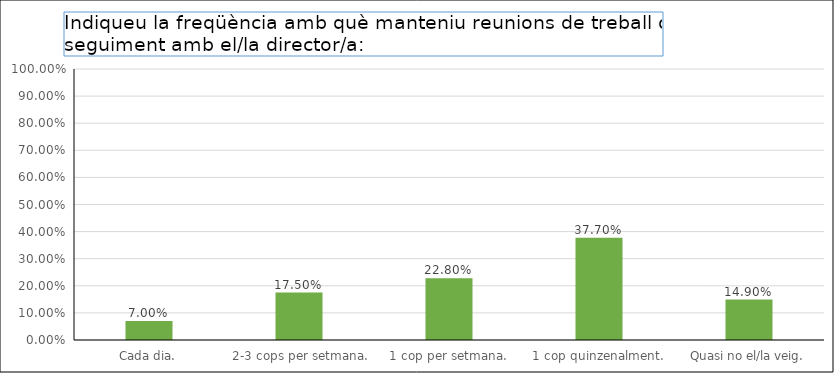
| Category | Series 0 |
|---|---|
| Cada dia. | 0.07 |
|  2-3 cops per setmana. | 0.175 |
| 1 cop per setmana. | 0.228 |
| 1 cop quinzenalment. | 0.377 |
| Quasi no el/la veig. | 0.149 |